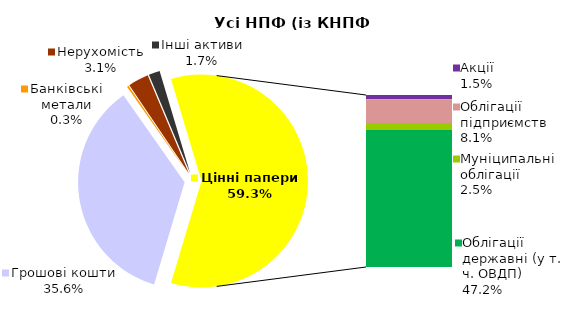
| Category | Усі НПФ (із КНПФ НБУ)* |
|---|---|
| Грошові кошти | 1323.144 |
| Банківські метали | 10.719 |
| Нерухомість | 115.995 |
| Інші активи | 63.11 |
| Акції | 54.463 |
| Облігації підприємств | 302.351 |
| Муніципальні облігації | 91.659 |
| Облігації державні (у т. ч. ОВДП) | 1751.443 |